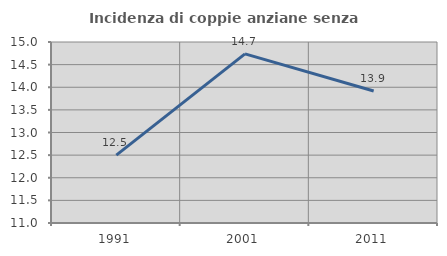
| Category | Incidenza di coppie anziane senza figli  |
|---|---|
| 1991.0 | 12.5 |
| 2001.0 | 14.737 |
| 2011.0 | 13.918 |